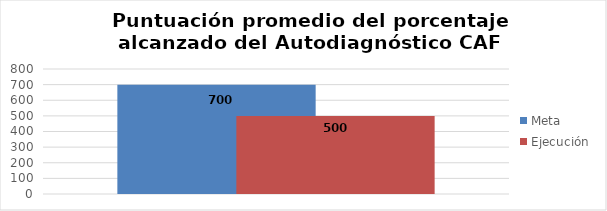
| Category | Meta | Ejecución |
|---|---|---|
| 0 | 700 | 500 |